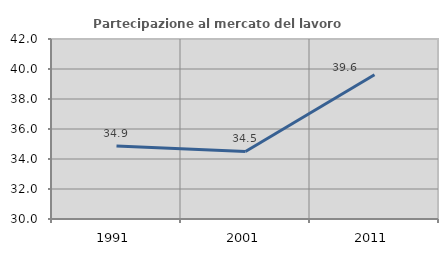
| Category | Partecipazione al mercato del lavoro  femminile |
|---|---|
| 1991.0 | 34.866 |
| 2001.0 | 34.502 |
| 2011.0 | 39.621 |